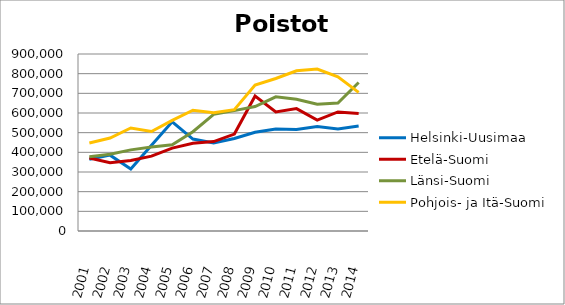
| Category | Helsinki-Uusimaa | Etelä-Suomi | Länsi-Suomi | Pohjois- ja Itä-Suomi |
|---|---|---|---|---|
| 2001.0 | 364073 | 370921 | 377009 | 447653 |
| 2002.0 | 385768 | 347620 | 389871 | 472943 |
| 2003.0 | 314876 | 358290 | 412529 | 523810 |
| 2004.0 | 436155 | 380470 | 427418 | 505646 |
| 2005.0 | 555508 | 421717 | 438361 | 562553 |
| 2006.0 | 467475 | 446505 | 504665 | 613961 |
| 2007.0 | 447710 | 454766 | 593118 | 601940 |
| 2008.0 | 470614 | 492969 | 611972 | 617177 |
| 2009.0 | 501828 | 686662 | 632943 | 741611 |
| 2010.0 | 518956 | 605736 | 682488 | 775429 |
| 2011.0 | 515744 | 622209 | 670040 | 814357 |
| 2012.0 | 531452 | 564270 | 644660 | 823251 |
| 2013.0 | 519079 | 605411 | 651097 | 783729 |
| 2014.0 | 533933 | 597168 | 755284 | 704790 |